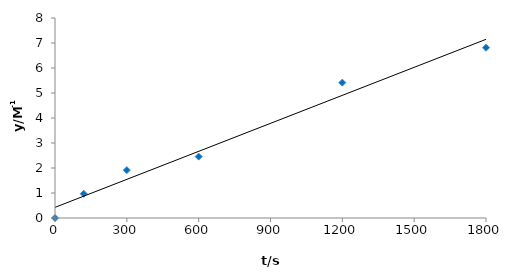
| Category | Series 0 |
|---|---|
| 0.0 | 0 |
| 120.0 | 0.969 |
| 300.0 | 1.914 |
| 600.0 | 2.456 |
| 1200.0 | 5.415 |
| 1800.0 | 6.811 |